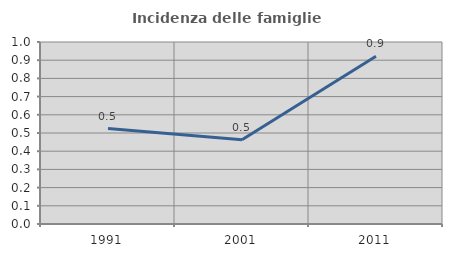
| Category | Incidenza delle famiglie numerose |
|---|---|
| 1991.0 | 0.524 |
| 2001.0 | 0.463 |
| 2011.0 | 0.922 |